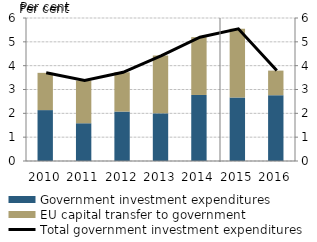
| Category | Government investment expenditures | EU capital transfer to government |
|---|---|---|
| 2010.0 | 2.136 | 1.563 |
| 2011.0 | 1.584 | 1.792 |
| 2012.0 | 2.074 | 1.65 |
| 2013.0 | 1.998 | 2.425 |
| 2014.0 | 2.77 | 2.425 |
| 2015.0 | 2.668 | 2.879 |
| 2016.0 | 2.76 | 1.033 |